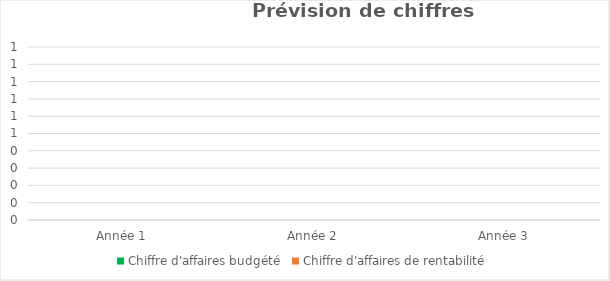
| Category | Chiffre d'affaires budgété | Chiffre d'affaires de rentabilité |
|---|---|---|
| Année 1 | 0 | 0 |
| Année 2 | 0 | 0 |
| Année 3 | 0 | 0 |